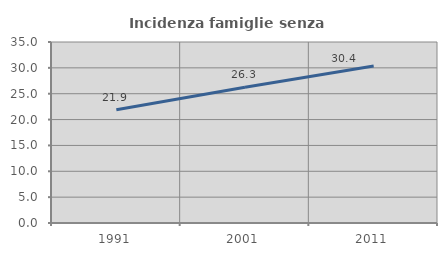
| Category | Incidenza famiglie senza nuclei |
|---|---|
| 1991.0 | 21.888 |
| 2001.0 | 26.262 |
| 2011.0 | 30.372 |